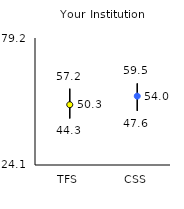
| Category | 25th | 75th | Mean |
|---|---|---|---|
| TFS | 44.3 | 57.2 | 50.26 |
| CSS | 47.6 | 59.5 | 53.98 |